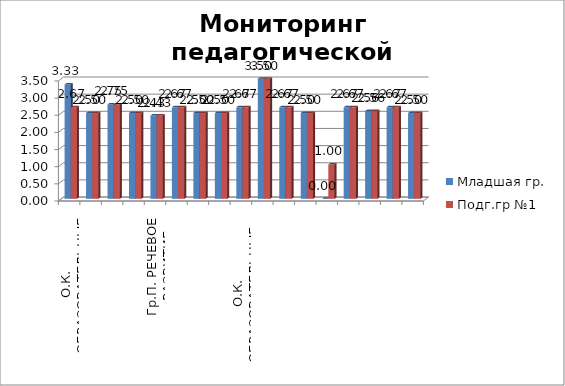
| Category | Младшая гр. | Подг.гр №1 |
|---|---|---|
| О.К. ОБРАЗОВАТЕЛЬНЫЕ ОРИЕНТИРЫ | 3.333 | 2.667 |
| О.К. ОБРАЗОВАТЕЛЬНАЯ ПРОГРАММА | 2.5 | 2.5 |
| О.К. СОДЕРЖАНИЕ ОД                                                               Гр.П. СОЦИАЛЬНО-КОММУНИКАТИВНОЕ РАЗВИТИЕ | 2.75 | 2.75 |
| Гр.П. ПОЗНАВАТЕЛЬНОЕ РАЗВИТИЕ | 2.5 | 2.5 |
| Гр.П. РЕЧЕВОЕ РАЗВИТИЕ | 2.429 | 2.429 |
| Гр.П.  ХУДОЖЕСТВЕННО-ЭСТЕТИЧЕСКОЕ РАЗИТИЕ | 2.667 | 2.667 |
| Гр.П. ФИЗИЧЕСКОЕ РАЗВИТИЕ | 2.5 | 2.5 |
| О.К. ОБРАЗОВАТЕЛЬНЫЙ ПРОЦЕСС | 2.5 | 2.5 |
| О.К. ОБРАЗОВАТЕЛЬНЫЕ УСЛВИЯ                         Кадровые условия.  | 2.667 | 2.667 |
| Рабочая нагрузка и условия труда | 3.5 | 3.5 |